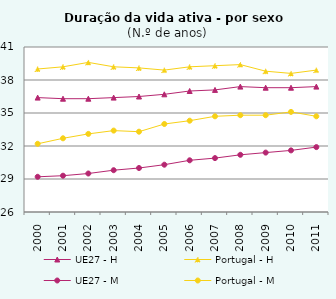
| Category | UE27 - H | Portugal - H | UE27 - M | Portugal - M |
|---|---|---|---|---|
| 2000.0 | 36.4 | 39 | 29.2 | 32.2 |
| 2001.0 | 36.3 | 39.2 | 29.3 | 32.7 |
| 2002.0 | 36.3 | 39.6 | 29.5 | 33.1 |
| 2003.0 | 36.4 | 39.2 | 29.8 | 33.4 |
| 2004.0 | 36.5 | 39.1 | 30 | 33.3 |
| 2005.0 | 36.7 | 38.9 | 30.3 | 34 |
| 2006.0 | 37 | 39.2 | 30.7 | 34.3 |
| 2007.0 | 37.1 | 39.3 | 30.9 | 34.7 |
| 2008.0 | 37.4 | 39.4 | 31.2 | 34.8 |
| 2009.0 | 37.3 | 38.8 | 31.4 | 34.8 |
| 2010.0 | 37.3 | 38.6 | 31.6 | 35.1 |
| 2011.0 | 37.4 | 38.9 | 31.9 | 34.7 |